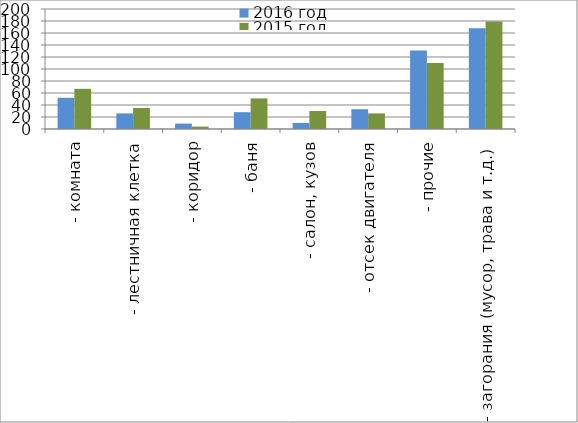
| Category | 2016 год | 2015 год |
|---|---|---|
|  - комната | 52 | 67 |
|  - лестничная клетка | 26 | 35 |
|  - коридор | 9 | 4 |
|  - баня | 28 | 51 |
|  - салон, кузов | 10 | 30 |
|  - отсек двигателя | 33 | 26 |
| - прочие | 131 | 110 |
| - загорания (мусор, трава и т.д.)  | 168 | 179 |